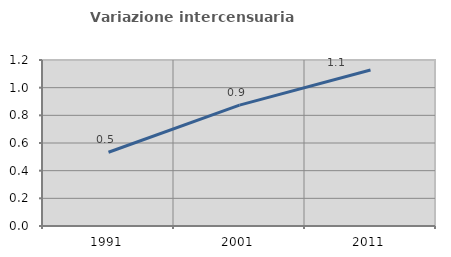
| Category | Variazione intercensuaria annua |
|---|---|
| 1991.0 | 0.533 |
| 2001.0 | 0.874 |
| 2011.0 | 1.128 |